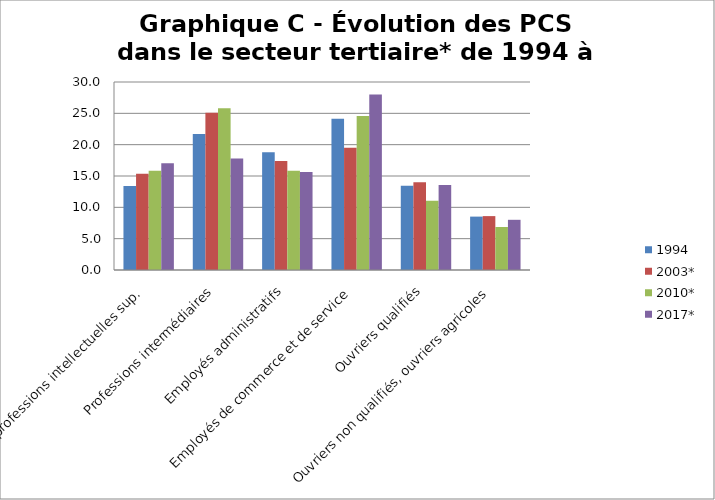
| Category | 1994 | 2003* | 2010* | 2017* |
|---|---|---|---|---|
| Cadres et professions intellectuelles sup. | 13.42 | 15.37 | 15.84 | 17.04 |
| Professions intermédiaires | 21.7 | 25.1 | 25.83 | 17.78 |
| Employés administratifs | 18.79 | 17.39 | 15.84 | 15.63 |
| Employés de commerce et de service | 24.14 | 19.52 | 24.57 | 27.99 |
| Ouvriers qualifiés | 13.44 | 14.02 | 11.07 | 13.55 |
| Ouvriers non qualifiés, ouvriers agricoles | 8.52 | 8.6 | 6.86 | 8.01 |